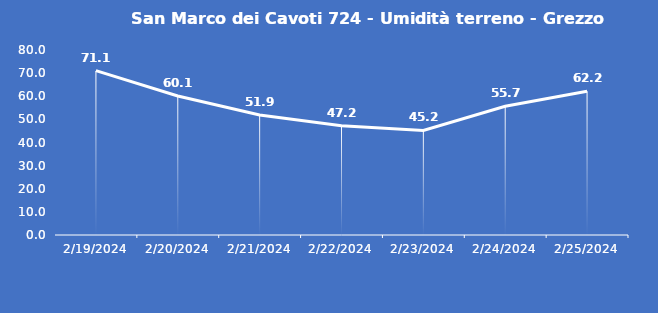
| Category | San Marco dei Cavoti 724 - Umidità terreno - Grezzo (%VWC) |
|---|---|
| 2/19/24 | 71.1 |
| 2/20/24 | 60.1 |
| 2/21/24 | 51.9 |
| 2/22/24 | 47.2 |
| 2/23/24 | 45.2 |
| 2/24/24 | 55.7 |
| 2/25/24 | 62.2 |